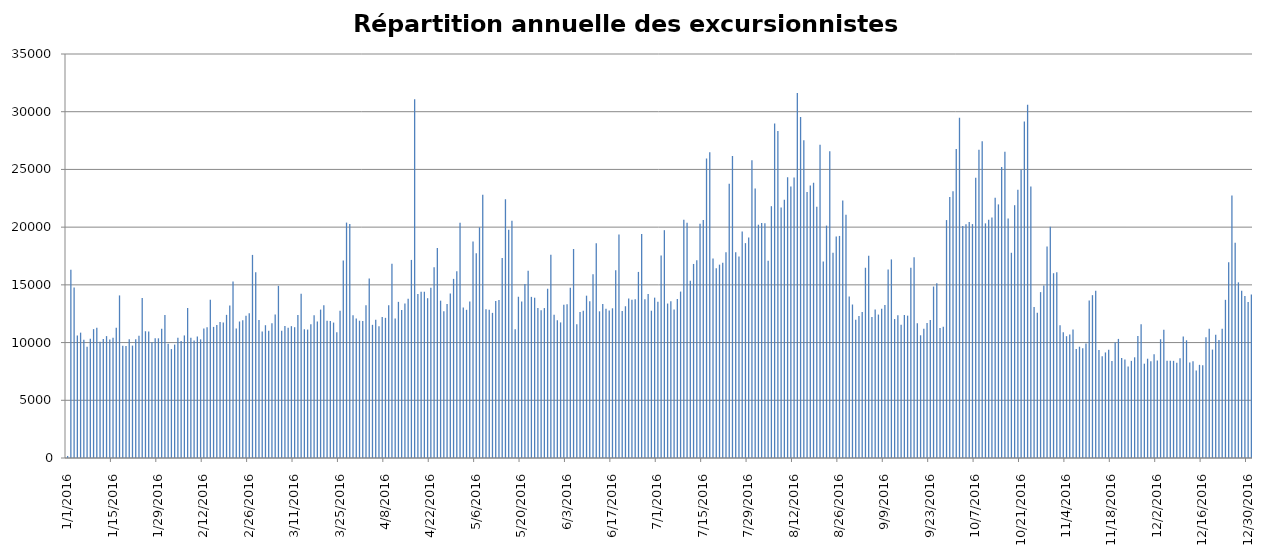
| Category | Series 0 |
|---|---|
| 1/1/16 | 177 |
| 1/2/16 | 16315 |
| 1/3/16 | 14780 |
| 1/4/16 | 10621 |
| 1/5/16 | 10860 |
| 1/6/16 | 10254 |
| 1/7/16 | 9648 |
| 1/8/16 | 10327 |
| 1/9/16 | 11164 |
| 1/10/16 | 11291 |
| 1/11/16 | 10072 |
| 1/12/16 | 10320 |
| 1/13/16 | 10560 |
| 1/14/16 | 10268 |
| 1/15/16 | 10414 |
| 1/16/16 | 11276 |
| 1/17/16 | 14085 |
| 1/18/16 | 9720 |
| 1/19/16 | 9713 |
| 1/20/16 | 10291 |
| 1/21/16 | 9740 |
| 1/22/16 | 10284 |
| 1/23/16 | 10598 |
| 1/24/16 | 13854 |
| 1/25/16 | 10982 |
| 1/26/16 | 10968 |
| 1/27/16 | 10022 |
| 1/28/16 | 10384 |
| 1/29/16 | 10369 |
| 1/30/16 | 11194 |
| 1/31/16 | 12382 |
| 2/1/16 | 9906 |
| 2/2/16 | 9436 |
| 2/3/16 | 9825 |
| 2/4/16 | 10419 |
| 2/5/16 | 10134 |
| 2/6/16 | 10618 |
| 2/7/16 | 12997 |
| 2/8/16 | 10416 |
| 2/9/16 | 10185 |
| 2/10/16 | 10529 |
| 2/11/16 | 10279 |
| 2/12/16 | 11228 |
| 2/13/16 | 11326 |
| 2/14/16 | 13720 |
| 2/15/16 | 11359 |
| 2/16/16 | 11531 |
| 2/17/16 | 11787 |
| 2/18/16 | 11731 |
| 2/19/16 | 12402 |
| 2/20/16 | 13222 |
| 2/21/16 | 15294 |
| 2/22/16 | 11229 |
| 2/23/16 | 11826 |
| 2/24/16 | 11944 |
| 2/25/16 | 12314 |
| 2/26/16 | 12532 |
| 2/27/16 | 17595 |
| 2/28/16 | 16089 |
| 2/29/16 | 11963 |
| 3/1/16 | 10958 |
| 3/2/16 | 11504 |
| 3/3/16 | 11025 |
| 3/4/16 | 11681 |
| 3/5/16 | 12425 |
| 3/6/16 | 14917 |
| 3/7/16 | 11017 |
| 3/8/16 | 11435 |
| 3/9/16 | 11277 |
| 3/10/16 | 11423 |
| 3/11/16 | 11332 |
| 3/12/16 | 12391 |
| 3/13/16 | 14239 |
| 3/14/16 | 11153 |
| 3/15/16 | 11126 |
| 3/16/16 | 11595 |
| 3/17/16 | 12364 |
| 3/18/16 | 11816 |
| 3/19/16 | 12857 |
| 3/20/16 | 13231 |
| 3/21/16 | 11894 |
| 3/22/16 | 11873 |
| 3/23/16 | 11732 |
| 3/24/16 | 10885 |
| 3/25/16 | 12755 |
| 3/26/16 | 17110 |
| 3/27/16 | 20393 |
| 3/28/16 | 20278 |
| 3/29/16 | 12374 |
| 3/30/16 | 12094 |
| 3/31/16 | 11894 |
| 4/1/16 | 11858 |
| 4/2/16 | 13244 |
| 4/3/16 | 15540 |
| 4/4/16 | 11538 |
| 4/5/16 | 11978 |
| 4/6/16 | 11411 |
| 4/7/16 | 12220 |
| 4/8/16 | 12142 |
| 4/9/16 | 13235 |
| 4/10/16 | 16831 |
| 4/11/16 | 12085 |
| 4/12/16 | 13527 |
| 4/13/16 | 12811 |
| 4/14/16 | 13382 |
| 4/15/16 | 13793 |
| 4/16/16 | 17161 |
| 4/17/16 | 31075 |
| 4/18/16 | 14214 |
| 4/19/16 | 14399 |
| 4/20/16 | 14403 |
| 4/21/16 | 13845 |
| 4/22/16 | 14757 |
| 4/23/16 | 16523 |
| 4/24/16 | 18199 |
| 4/25/16 | 13631 |
| 4/26/16 | 12703 |
| 4/27/16 | 13341 |
| 4/28/16 | 14253 |
| 4/29/16 | 15519 |
| 4/30/16 | 16171 |
| 5/1/16 | 20370 |
| 5/2/16 | 13049 |
| 5/3/16 | 12838 |
| 5/4/16 | 13566 |
| 5/5/16 | 18754 |
| 5/6/16 | 17746 |
| 5/7/16 | 19981 |
| 5/8/16 | 22814 |
| 5/9/16 | 12878 |
| 5/10/16 | 12834 |
| 5/11/16 | 12574 |
| 5/12/16 | 13601 |
| 5/13/16 | 13681 |
| 5/14/16 | 17321 |
| 5/15/16 | 22412 |
| 5/16/16 | 19781 |
| 5/17/16 | 20550 |
| 5/18/16 | 11158 |
| 5/19/16 | 13970 |
| 5/20/16 | 13563 |
| 5/21/16 | 15074 |
| 5/22/16 | 16222 |
| 5/23/16 | 13959 |
| 5/24/16 | 13886 |
| 5/25/16 | 12990 |
| 5/26/16 | 12799 |
| 5/27/16 | 12989 |
| 5/28/16 | 14663 |
| 5/29/16 | 17616 |
| 5/30/16 | 12418 |
| 5/31/16 | 11944 |
| 6/1/16 | 11746 |
| 6/2/16 | 13276 |
| 6/3/16 | 13325 |
| 6/4/16 | 14749 |
| 6/5/16 | 18106 |
| 6/6/16 | 11590 |
| 6/7/16 | 12639 |
| 6/8/16 | 12751 |
| 6/9/16 | 14063 |
| 6/10/16 | 13588 |
| 6/11/16 | 15929 |
| 6/12/16 | 18612 |
| 6/13/16 | 12708 |
| 6/14/16 | 13344 |
| 6/15/16 | 12938 |
| 6/16/16 | 12782 |
| 6/17/16 | 12970 |
| 6/18/16 | 16268 |
| 6/19/16 | 19368 |
| 6/20/16 | 12725 |
| 6/21/16 | 13147 |
| 6/22/16 | 13817 |
| 6/23/16 | 13703 |
| 6/24/16 | 13744 |
| 6/25/16 | 16121 |
| 6/26/16 | 19405 |
| 6/27/16 | 13746 |
| 6/28/16 | 14213 |
| 6/29/16 | 12760 |
| 6/30/16 | 13892 |
| 7/1/16 | 13532 |
| 7/2/16 | 17534 |
| 7/3/16 | 19737 |
| 7/4/16 | 13382 |
| 7/5/16 | 13587 |
| 7/6/16 | 12857 |
| 7/7/16 | 13772 |
| 7/8/16 | 14418 |
| 7/9/16 | 20634 |
| 7/10/16 | 20382 |
| 7/11/16 | 15359 |
| 7/12/16 | 16812 |
| 7/13/16 | 17129 |
| 7/14/16 | 20291 |
| 7/15/16 | 20614 |
| 7/16/16 | 25951 |
| 7/17/16 | 26480 |
| 7/18/16 | 17285 |
| 7/19/16 | 16446 |
| 7/20/16 | 16752 |
| 7/21/16 | 16920 |
| 7/22/16 | 17832 |
| 7/23/16 | 23769 |
| 7/24/16 | 26155 |
| 7/25/16 | 17823 |
| 7/26/16 | 17457 |
| 7/27/16 | 19628 |
| 7/28/16 | 18616 |
| 7/29/16 | 19104 |
| 7/30/16 | 25790 |
| 7/31/16 | 23344 |
| 8/1/16 | 20211 |
| 8/2/16 | 20366 |
| 8/3/16 | 20333 |
| 8/4/16 | 17095 |
| 8/5/16 | 21816 |
| 8/6/16 | 28983 |
| 8/7/16 | 28322 |
| 8/8/16 | 21693 |
| 8/9/16 | 22364 |
| 8/10/16 | 24313 |
| 8/11/16 | 23530 |
| 8/12/16 | 24292 |
| 8/13/16 | 31619 |
| 8/14/16 | 29547 |
| 8/15/16 | 27527 |
| 8/16/16 | 23042 |
| 8/17/16 | 23603 |
| 8/18/16 | 23847 |
| 8/19/16 | 21765.5 |
| 8/20/16 | 27131 |
| 8/21/16 | 17025 |
| 8/22/16 | 20135 |
| 8/23/16 | 26582 |
| 8/24/16 | 17790.5 |
| 8/25/16 | 19184 |
| 8/26/16 | 19239 |
| 8/27/16 | 22315 |
| 8/28/16 | 21079 |
| 8/29/16 | 13982 |
| 8/30/16 | 13297 |
| 8/31/16 | 11978 |
| 9/1/16 | 12302 |
| 9/2/16 | 12646 |
| 9/3/16 | 16482 |
| 9/4/16 | 17511 |
| 9/5/16 | 12217 |
| 9/6/16 | 12862 |
| 9/7/16 | 12426 |
| 9/8/16 | 12922 |
| 9/9/16 | 13262 |
| 9/10/16 | 16327 |
| 9/11/16 | 17206 |
| 9/12/16 | 12039 |
| 9/13/16 | 12373 |
| 9/14/16 | 11539 |
| 9/15/16 | 12389 |
| 9/16/16 | 12333 |
| 9/17/16 | 16491 |
| 9/18/16 | 17382 |
| 9/19/16 | 11671 |
| 9/20/16 | 10631 |
| 9/21/16 | 11200 |
| 9/22/16 | 11693 |
| 9/23/16 | 11947 |
| 9/24/16 | 14854 |
| 9/25/16 | 15140 |
| 9/26/16 | 11256 |
| 9/27/16 | 11374 |
| 9/28/16 | 20613 |
| 9/29/16 | 22605 |
| 9/30/16 | 23099 |
| 10/1/16 | 26760 |
| 10/2/16 | 29479 |
| 10/3/16 | 20105 |
| 10/4/16 | 20259 |
| 10/5/16 | 20446 |
| 10/6/16 | 20266 |
| 10/7/16 | 24270 |
| 10/8/16 | 26710 |
| 10/9/16 | 27452 |
| 10/10/16 | 20328 |
| 10/11/16 | 20638 |
| 10/12/16 | 20832 |
| 10/13/16 | 22554 |
| 10/14/16 | 21970 |
| 10/15/16 | 25201 |
| 10/16/16 | 26522 |
| 10/17/16 | 20741 |
| 10/18/16 | 17779 |
| 10/19/16 | 21901 |
| 10/20/16 | 23245 |
| 10/21/16 | 24982 |
| 10/22/16 | 29142 |
| 10/23/16 | 30610 |
| 10/24/16 | 23525 |
| 10/25/16 | 13092 |
| 10/26/16 | 12590 |
| 10/27/16 | 14370 |
| 10/28/16 | 14955 |
| 10/29/16 | 18322 |
| 10/30/16 | 20040 |
| 10/31/16 | 16009 |
| 11/1/16 | 16096 |
| 11/2/16 | 11508 |
| 11/3/16 | 10896 |
| 11/4/16 | 10554 |
| 11/5/16 | 10706 |
| 11/6/16 | 11143 |
| 11/7/16 | 9442 |
| 11/8/16 | 9642 |
| 11/9/16 | 9504 |
| 11/10/16 | 9927 |
| 11/11/16 | 13643 |
| 11/12/16 | 14108 |
| 11/13/16 | 14498 |
| 11/14/16 | 9366 |
| 11/15/16 | 8811 |
| 11/16/16 | 9146 |
| 11/17/16 | 9375 |
| 11/18/16 | 8409 |
| 11/19/16 | 10010 |
| 11/20/16 | 10318 |
| 11/21/16 | 8668 |
| 11/22/16 | 8526 |
| 11/23/16 | 7917 |
| 11/24/16 | 8415 |
| 11/25/16 | 8723 |
| 11/26/16 | 10564 |
| 11/27/16 | 11597 |
| 11/28/16 | 8172 |
| 11/29/16 | 8602 |
| 11/30/16 | 8380 |
| 12/1/16 | 8978 |
| 12/2/16 | 8447 |
| 12/3/16 | 10290 |
| 12/4/16 | 11119 |
| 12/5/16 | 8434 |
| 12/6/16 | 8435 |
| 12/7/16 | 8418 |
| 12/8/16 | 8248 |
| 12/9/16 | 8644 |
| 12/10/16 | 10527 |
| 12/11/16 | 10201 |
| 12/12/16 | 8283 |
| 12/13/16 | 8378 |
| 12/14/16 | 7584 |
| 12/15/16 | 8072 |
| 12/16/16 | 8031 |
| 12/17/16 | 10458 |
| 12/18/16 | 11208 |
| 12/19/16 | 9392 |
| 12/20/16 | 10687 |
| 12/21/16 | 10222 |
| 12/22/16 | 11190 |
| 12/23/16 | 13703 |
| 12/24/16 | 16960 |
| 12/25/16 | 22746 |
| 12/26/16 | 18656 |
| 12/27/16 | 15218 |
| 12/28/16 | 14493 |
| 12/29/16 | 14027 |
| 12/30/16 | 13507 |
| 12/31/16 | 14166 |